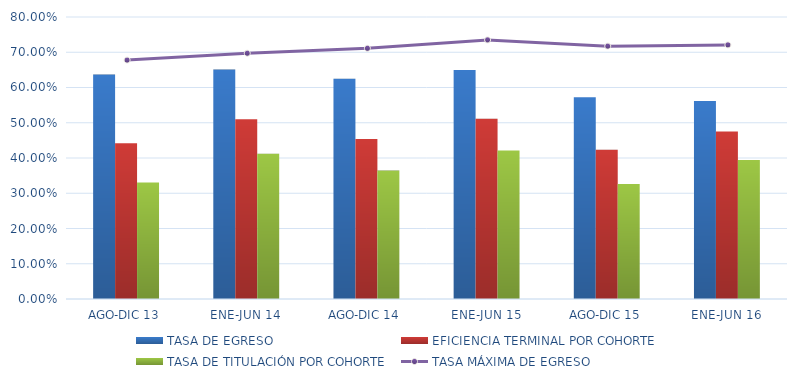
| Category | TASA DE EGRESO | EFICIENCIA TERMINAL POR COHORTE | TASA DE TITULACIÓN POR COHORTE |
|---|---|---|---|
| AGO-DIC 13 | 0.637 | 0.442 | 0.331 |
| ENE-JUN 14 | 0.651 | 0.51 | 0.412 |
| AGO-DIC 14 | 0.625 | 0.454 | 0.364 |
| ENE-JUN 15 | 0.649 | 0.511 | 0.421 |
| AGO-DIC 15 | 0.573 | 0.424 | 0.326 |
| ENE-JUN 16 | 0.562 | 0.475 | 0.394 |